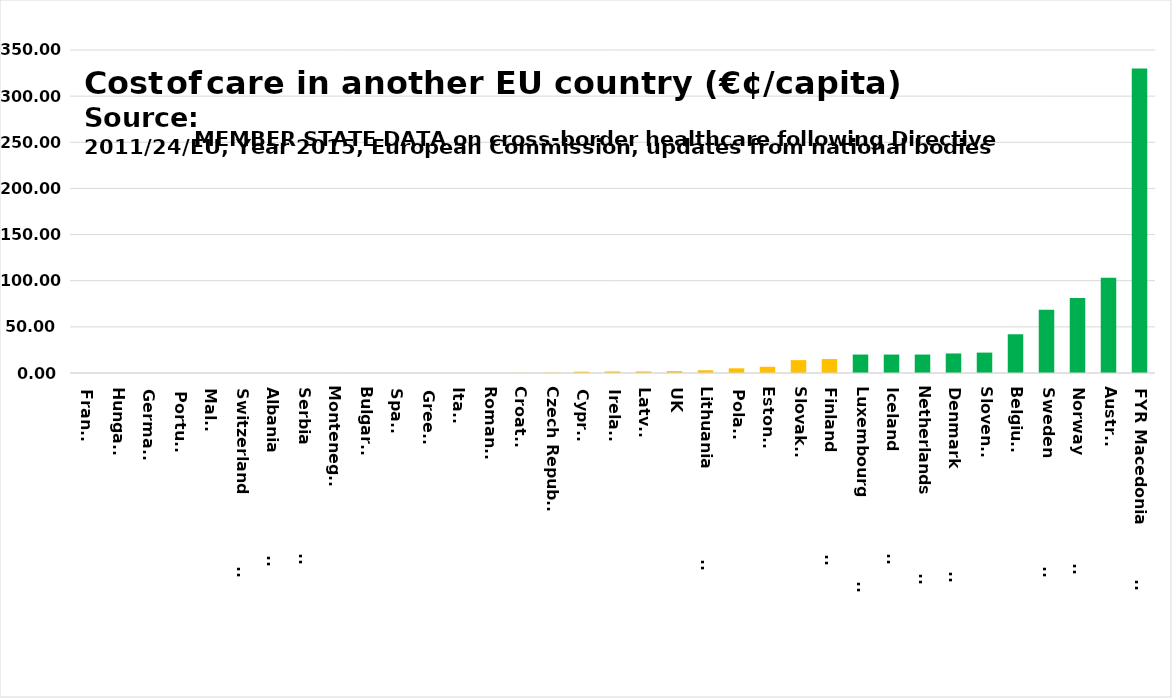
| Category | Series 0 |
|---|---|
| France | 0 |
| Hungary | 0 |
| Germany | 0 |
| Portugal | 0 |
| Malta | 0 |
| Switzerland                   | 0 |
| Albania                       | 0 |
| Serbia                        | 0 |
| Montenegro | 0 |
| Bulgaria | 0.006 |
| Spain | 0.009 |
| Greece | 0.023 |
| Italy | 0.036 |
| Romania | 0.083 |
| Croatia | 0.141 |
| Czech Republic | 0.402 |
| Cyprus | 1.411 |
| Ireland | 1.712 |
| Latvia | 1.738 |
| UK | 2.034 |
| Lithuania                     | 2.963 |
| Poland | 5.094 |
| Estonia | 6.763 |
| Slovakia | 13.943 |
| Finland                       | 15.12 |
| Luxembourg                    | 20 |
| Iceland                       | 20 |
| Netherlands                   | 20 |
| Denmark                       | 21.182 |
| Slovenia | 22.11 |
| Belgium | 41.979 |
| Sweden                        | 68.475 |
| Norway                        | 81.227 |
| Austria | 103.2 |
| FYR Macedonia                | 330 |